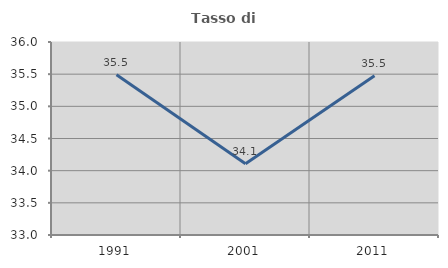
| Category | Tasso di occupazione   |
|---|---|
| 1991.0 | 35.49 |
| 2001.0 | 34.108 |
| 2011.0 | 35.474 |